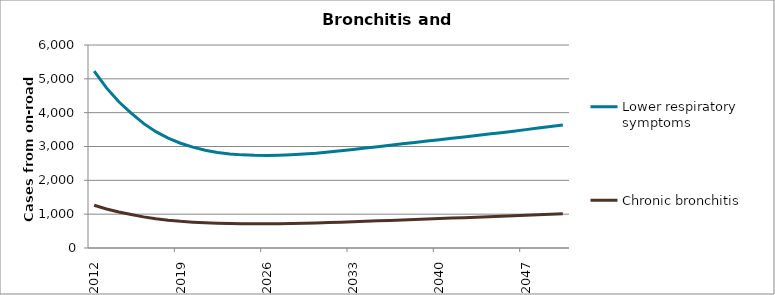
| Category | Lower respiratory symptoms | Chronic bronchitis |
|---|---|---|
| 2012.0 | 5231.023 | 1264.644 |
| 2013.0 | 4732.552 | 1154.022 |
| 2014.0 | 4321.382 | 1063.136 |
| 2015.0 | 3984.581 | 989.367 |
| 2016.0 | 3682.791 | 920.185 |
| 2017.0 | 3439.639 | 864.812 |
| 2018.0 | 3246.538 | 821.372 |
| 2019.0 | 3096.643 | 788.361 |
| 2020.0 | 2981.755 | 763.978 |
| 2021.0 | 2890.998 | 743.331 |
| 2022.0 | 2825.512 | 729.205 |
| 2023.0 | 2780.816 | 720.535 |
| 2024.0 | 2752.568 | 716.261 |
| 2025.0 | 2737.984 | 715.733 |
| 2026.0 | 2736.272 | 716.438 |
| 2027.0 | 2743.926 | 719.816 |
| 2028.0 | 2758.936 | 725.473 |
| 2029.0 | 2779.302 | 733.024 |
| 2030.0 | 2803.76 | 742.244 |
| 2031.0 | 2837.7 | 751.926 |
| 2032.0 | 2874.169 | 762.833 |
| 2033.0 | 2912.933 | 774.972 |
| 2034.0 | 2952.766 | 788.071 |
| 2035.0 | 2992.53 | 801.894 |
| 2036.0 | 3036.128 | 814.616 |
| 2037.0 | 3078.807 | 827.817 |
| 2038.0 | 3120.334 | 841.542 |
| 2039.0 | 3160.672 | 855.806 |
| 2040.0 | 3199.987 | 870.574 |
| 2041.0 | 3242.038 | 883.685 |
| 2042.0 | 3283.62 | 897.325 |
| 2043.0 | 3325.185 | 911.53 |
| 2044.0 | 3366.54 | 926.128 |
| 2045.0 | 3407.672 | 941.118 |
| 2046.0 | 3453.204 | 954.658 |
| 2047.0 | 3499.107 | 968.613 |
| 2048.0 | 3544.97 | 982.954 |
| 2049.0 | 3590.541 | 997.679 |
| 2050.0 | 3635.586 | 1012.762 |